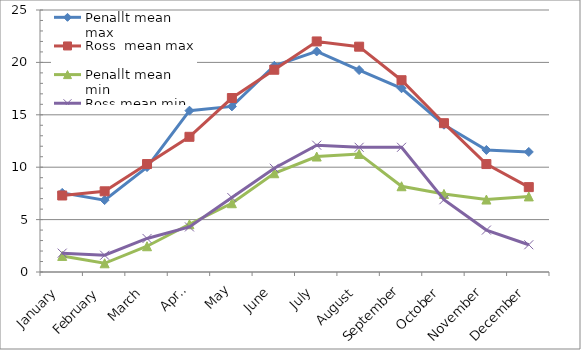
| Category | Penallt mean max | Ross  mean max | Penallt mean min | Ross mean min |
|---|---|---|---|---|
| January | 7.548 | 7.3 | 1.535 | 1.8 |
| February | 6.859 | 7.7 | 0.831 | 1.6 |
| March | 10.013 | 10.3 | 2.458 | 3.2 |
| April | 15.393 | 12.9 | 4.557 | 4.3 |
| May | 15.803 | 16.6 | 6.561 | 7.1 |
| June | 19.677 | 19.3 | 9.423 | 9.9 |
| July | 21.045 | 22 | 11.019 | 12.1 |
| August | 19.268 | 21.5 | 11.268 | 11.9 |
| September | 17.533 | 18.3 | 8.183 | 11.9 |
| October | 14.055 | 14.2 | 7.452 | 6.9 |
| November | 11.647 | 10.3 | 6.913 | 4 |
| December | 11.455 | 8.1 | 7.213 | 2.6 |